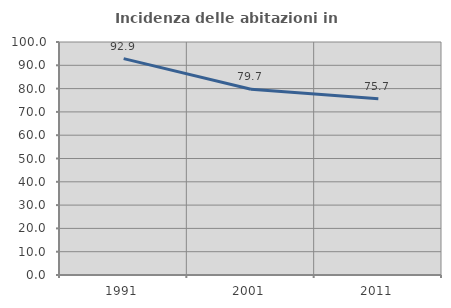
| Category | Incidenza delle abitazioni in proprietà  |
|---|---|
| 1991.0 | 92.877 |
| 2001.0 | 79.734 |
| 2011.0 | 75.667 |